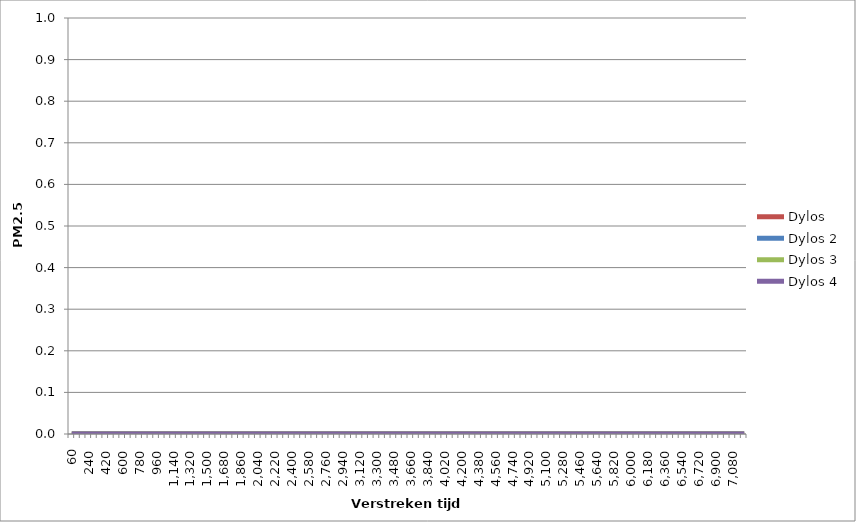
| Category | Dylos | Dylos 2 | Dylos 3 | Dylos 4 |
|---|---|---|---|---|
| 60.0 | 0 | 0 | 0 | 0 |
| 120.0 | 0 | 0 | 0 | 0 |
| 180.0 | 0 | 0 | 0 | 0 |
| 240.0 | 0 | 0 | 0 | 0 |
| 300.0 | 0 | 0 | 0 | 0 |
| 360.0 | 0 | 0 | 0 | 0 |
| 420.0 | 0 | 0 | 0 | 0 |
| 480.0 | 0 | 0 | 0 | 0 |
| 540.0 | 0 | 0 | 0 | 0 |
| 600.0 | 0 | 0 | 0 | 0 |
| 660.0 | 0 | 0 | 0 | 0 |
| 720.0 | 0 | 0 | 0 | 0 |
| 780.0 | 0 | 0 | 0 | 0 |
| 840.0 | 0 | 0 | 0 | 0 |
| 900.0 | 0 | 0 | 0 | 0 |
| 960.0 | 0 | 0 | 0 | 0 |
| 1020.0 | 0 | 0 | 0 | 0 |
| 1080.0 | 0 | 0 | 0 | 0 |
| 1140.0 | 0 | 0 | 0 | 0 |
| 1200.0 | 0 | 0 | 0 | 0 |
| 1260.0 | 0 | 0 | 0 | 0 |
| 1320.0 | 0 | 0 | 0 | 0 |
| 1380.0 | 0 | 0 | 0 | 0 |
| 1440.0 | 0 | 0 | 0 | 0 |
| 1500.0 | 0 | 0 | 0 | 0 |
| 1560.0 | 0 | 0 | 0 | 0 |
| 1620.0 | 0 | 0 | 0 | 0 |
| 1680.0 | 0 | 0 | 0 | 0 |
| 1740.0 | 0 | 0 | 0 | 0 |
| 1800.0 | 0 | 0 | 0 | 0 |
| 1860.0 | 0 | 0 | 0 | 0 |
| 1920.0 | 0 | 0 | 0 | 0 |
| 1980.0 | 0 | 0 | 0 | 0 |
| 2040.0 | 0 | 0 | 0 | 0 |
| 2100.0 | 0 | 0 | 0 | 0 |
| 2160.0 | 0 | 0 | 0 | 0 |
| 2220.0 | 0 | 0 | 0 | 0 |
| 2280.0 | 0 | 0 | 0 | 0 |
| 2340.0 | 0 | 0 | 0 | 0 |
| 2400.0 | 0 | 0 | 0 | 0 |
| 2460.0 | 0 | 0 | 0 | 0 |
| 2520.0 | 0 | 0 | 0 | 0 |
| 2580.0 | 0 | 0 | 0 | 0 |
| 2640.0 | 0 | 0 | 0 | 0 |
| 2700.0 | 0 | 0 | 0 | 0 |
| 2760.0 | 0 | 0 | 0 | 0 |
| 2820.0 | 0 | 0 | 0 | 0 |
| 2880.0 | 0 | 0 | 0 | 0 |
| 2940.0 | 0 | 0 | 0 | 0 |
| 3000.0 | 0 | 0 | 0 | 0 |
| 3060.0 | 0 | 0 | 0 | 0 |
| 3120.0 | 0 | 0 | 0 | 0 |
| 3180.0 | 0 | 0 | 0 | 0 |
| 3240.0 | 0 | 0 | 0 | 0 |
| 3300.0 | 0 | 0 | 0 | 0 |
| 3360.0 | 0 | 0 | 0 | 0 |
| 3420.0 | 0 | 0 | 0 | 0 |
| 3480.0 | 0 | 0 | 0 | 0 |
| 3540.0 | 0 | 0 | 0 | 0 |
| 3600.0 | 0 | 0 | 0 | 0 |
| 3660.0 | 0 | 0 | 0 | 0 |
| 3720.0 | 0 | 0 | 0 | 0 |
| 3780.0 | 0 | 0 | 0 | 0 |
| 3840.0 | 0 | 0 | 0 | 0 |
| 3900.0 | 0 | 0 | 0 | 0 |
| 3960.0 | 0 | 0 | 0 | 0 |
| 4020.0 | 0 | 0 | 0 | 0 |
| 4080.0 | 0 | 0 | 0 | 0 |
| 4140.0 | 0 | 0 | 0 | 0 |
| 4200.0 | 0 | 0 | 0 | 0 |
| 4260.0 | 0 | 0 | 0 | 0 |
| 4320.0 | 0 | 0 | 0 | 0 |
| 4380.0 | 0 | 0 | 0 | 0 |
| 4440.0 | 0 | 0 | 0 | 0 |
| 4500.0 | 0 | 0 | 0 | 0 |
| 4560.0 | 0 | 0 | 0 | 0 |
| 4620.0 | 0 | 0 | 0 | 0 |
| 4680.0 | 0 | 0 | 0 | 0 |
| 4740.0 | 0 | 0 | 0 | 0 |
| 4800.0 | 0 | 0 | 0 | 0 |
| 4860.0 | 0 | 0 | 0 | 0 |
| 4920.0 | 0 | 0 | 0 | 0 |
| 4980.0 | 0 | 0 | 0 | 0 |
| 5040.0 | 0 | 0 | 0 | 0 |
| 5100.0 | 0 | 0 | 0 | 0 |
| 5160.0 | 0 | 0 | 0 | 0 |
| 5220.0 | 0 | 0 | 0 | 0 |
| 5280.0 | 0 | 0 | 0 | 0 |
| 5340.0 | 0 | 0 | 0 | 0 |
| 5400.0 | 0 | 0 | 0 | 0 |
| 5460.0 | 0 | 0 | 0 | 0 |
| 5520.0 | 0 | 0 | 0 | 0 |
| 5580.0 | 0 | 0 | 0 | 0 |
| 5640.0 | 0 | 0 | 0 | 0 |
| 5700.0 | 0 | 0 | 0 | 0 |
| 5760.0 | 0 | 0 | 0 | 0 |
| 5820.0 | 0 | 0 | 0 | 0 |
| 5880.0 | 0 | 0 | 0 | 0 |
| 5940.0 | 0 | 0 | 0 | 0 |
| 6000.0 | 0 | 0 | 0 | 0 |
| 6060.0 | 0 | 0 | 0 | 0 |
| 6120.0 | 0 | 0 | 0 | 0 |
| 6180.0 | 0 | 0 | 0 | 0 |
| 6240.0 | 0 | 0 | 0 | 0 |
| 6300.0 | 0 | 0 | 0 | 0 |
| 6360.0 | 0 | 0 | 0 | 0 |
| 6420.0 | 0 | 0 | 0 | 0 |
| 6480.0 | 0 | 0 | 0 | 0 |
| 6540.0 | 0 | 0 | 0 | 0 |
| 6600.0 | 0 | 0 | 0 | 0 |
| 6660.0 | 0 | 0 | 0 | 0 |
| 6720.0 | 0 | 0 | 0 | 0 |
| 6780.0 | 0 | 0 | 0 | 0 |
| 6840.0 | 0 | 0 | 0 | 0 |
| 6900.0 | 0 | 0 | 0 | 0 |
| 6960.0 | 0 | 0 | 0 | 0 |
| 7020.0 | 0 | 0 | 0 | 0 |
| 7080.0 | 0 | 0 | 0 | 0 |
| 7140.0 | 0 | 0 | 0 | 0 |
| 7200.0 | 0 | 0 | 0 | 0 |